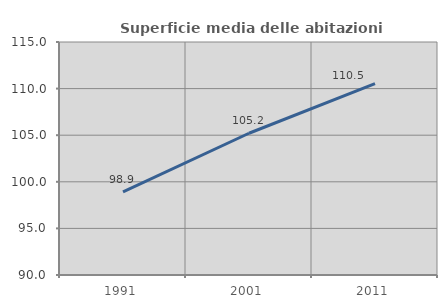
| Category | Superficie media delle abitazioni occupate |
|---|---|
| 1991.0 | 98.908 |
| 2001.0 | 105.209 |
| 2011.0 | 110.529 |